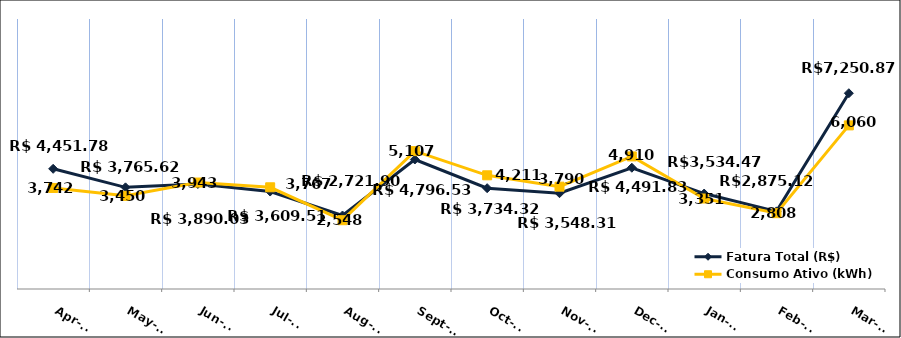
| Category | Fatura Total (R$) |
|---|---|
| 2022-04-01 | 4451.78 |
| 2022-05-01 | 3765.62 |
| 2022-06-01 | 3890.03 |
| 2022-07-01 | 3609.51 |
| 2022-08-01 | 2721.9 |
| 2022-09-01 | 4796.53 |
| 2022-10-01 | 3734.32 |
| 2022-11-01 | 3548.31 |
| 2022-12-01 | 4491.83 |
| 2023-01-01 | 3534.47 |
| 2023-02-01 | 2875.12 |
| 2023-03-01 | 7250.87 |